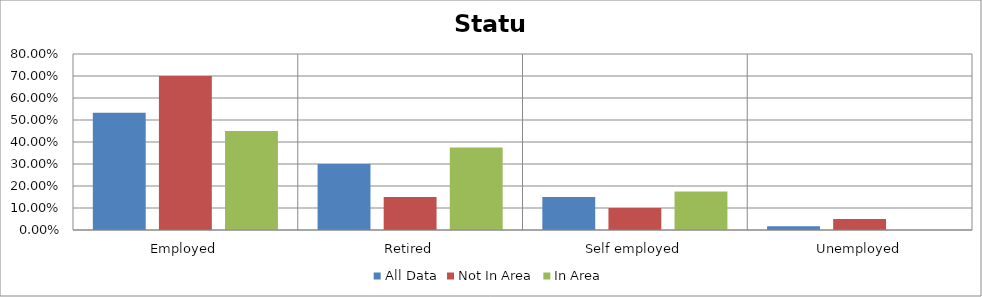
| Category | All Data | Not In Area | In Area |
|---|---|---|---|
| Employed | 0.533 | 0.7 | 0.45 |
| Retired | 0.3 | 0.15 | 0.375 |
| Self employed | 0.15 | 0.1 | 0.175 |
| Unemployed | 0.017 | 0.05 | 0 |